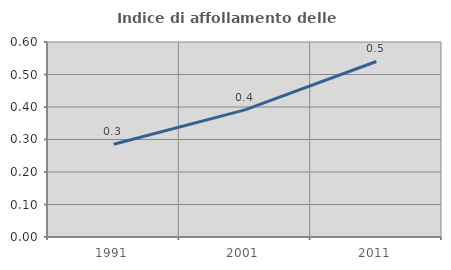
| Category | Indice di affollamento delle abitazioni  |
|---|---|
| 1991.0 | 0.286 |
| 2001.0 | 0.391 |
| 2011.0 | 0.54 |